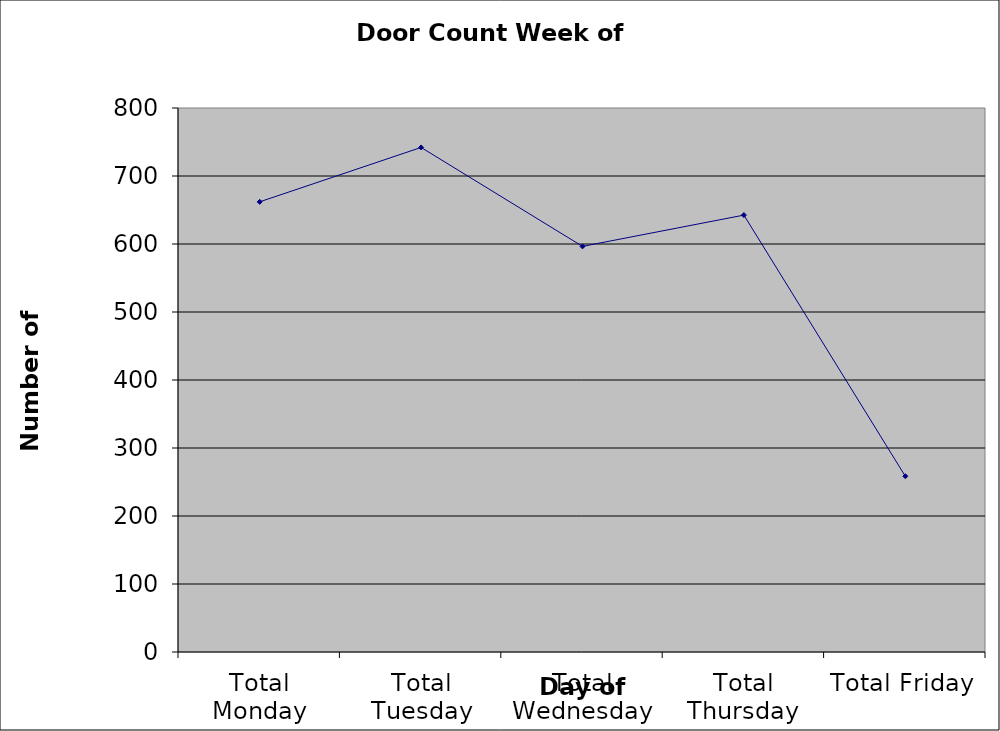
| Category | Series 0 |
|---|---|
| Total Monday | 662 |
| Total Tuesday | 742 |
| Total Wednesday | 596.5 |
| Total Thursday | 642.5 |
| Total Friday | 258.5 |